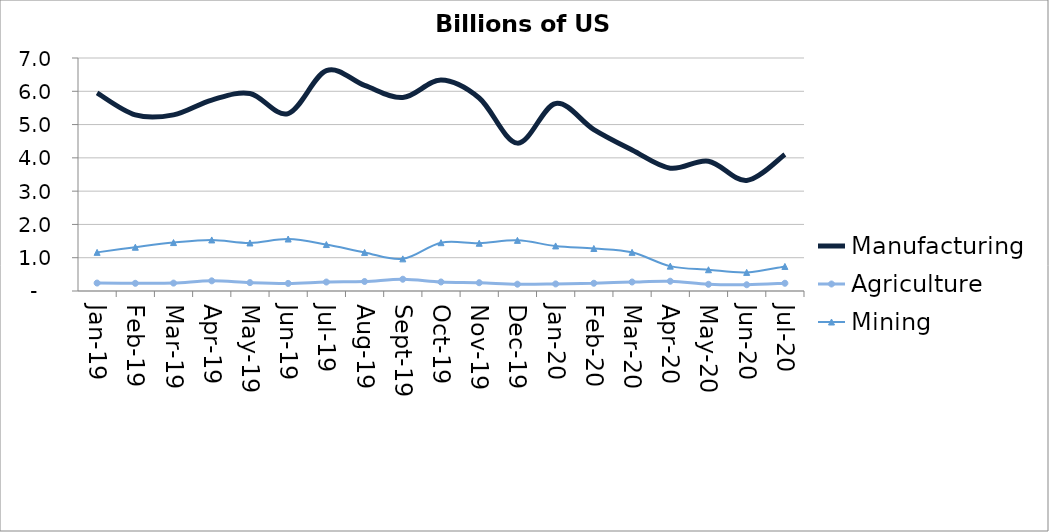
| Category | Manufacturing | Agriculture | Mining |
|---|---|---|---|
| 2019-01-31 | 5.951 | 0.239 | 1.16 |
| 2019-02-28 | 5.291 | 0.231 | 1.315 |
| 2019-03-31 | 5.292 | 0.237 | 1.455 |
| 2019-04-30 | 5.737 | 0.305 | 1.534 |
| 2019-05-31 | 5.934 | 0.252 | 1.443 |
| 2019-06-30 | 5.332 | 0.228 | 1.562 |
| 2019-07-31 | 6.619 | 0.269 | 1.396 |
| 2019-08-31 | 6.176 | 0.286 | 1.159 |
| 2019-09-30 | 5.813 | 0.354 | 0.965 |
| 2019-10-31 | 6.337 | 0.271 | 1.451 |
| 2019-11-30 | 5.798 | 0.249 | 1.434 |
| 2019-12-31 | 4.443 | 0.204 | 1.521 |
| 2020-01-31 | 5.634 | 0.213 | 1.354 |
| 2020-02-29 | 4.85 | 0.233 | 1.277 |
| 2020-03-31 | 4.236 | 0.27 | 1.162 |
| 2020-04-30 | 3.69 | 0.294 | 0.747 |
| 2020-05-31 | 3.899 | 0.201 | 0.639 |
| 2020-06-30 | 3.323 | 0.188 | 0.558 |
| 2020-07-31 | 4.101 | 0.233 | 0.738 |